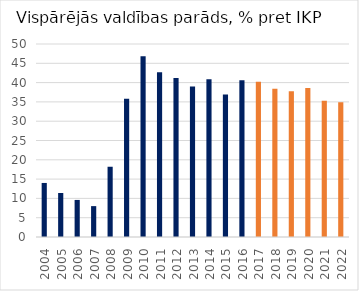
| Category | Latvia |
|---|---|
| 2004 | 14 |
| 2005 | 11.4 |
| 2006 | 9.6 |
| 2007 | 8 |
| 2008 | 18.2 |
| 2009 | 35.8 |
| 2010 | 46.8 |
| 2011 | 42.7 |
| 2012 | 41.2 |
| 2013 | 39 |
| 2014 | 40.9 |
| 2015 | 36.9 |
| 2016 | 40.6 |
| 2017 | 40.2 |
| 2018 | 38.4 |
| 2019 | 37.752 |
| 2020 | 38.594 |
| 2021 | 35.314 |
| 2022 | 34.901 |